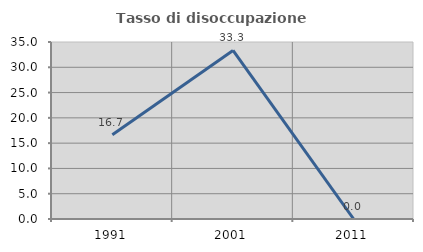
| Category | Tasso di disoccupazione giovanile  |
|---|---|
| 1991.0 | 16.667 |
| 2001.0 | 33.333 |
| 2011.0 | 0 |